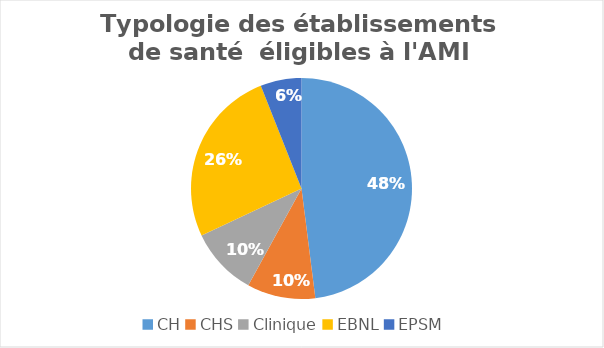
| Category | Series 0 |
|---|---|
| CH | 24 |
| CHS | 5 |
| Clinique | 5 |
| EBNL | 13 |
| EPSM | 3 |